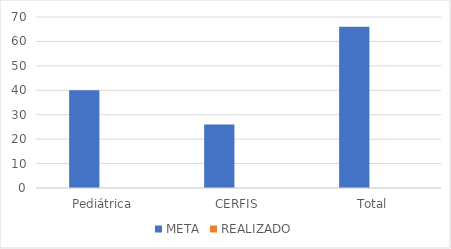
| Category | META | REALIZADO |
|---|---|---|
| Pediátrica | 40 | 0 |
| CERFIS | 26 | 0 |
| Total | 66 | 0 |